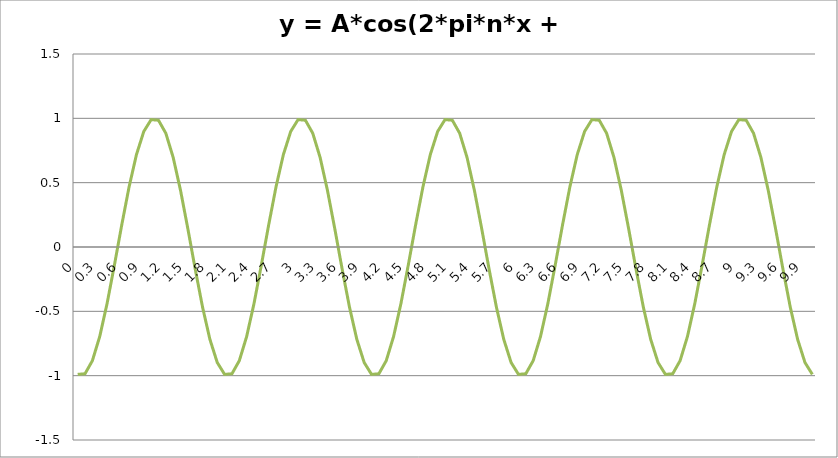
| Category | y |
|---|---|
| 0.0 | -0.99 |
| 0.1 | -0.985 |
| 0.2 | -0.884 |
| 0.3 | -0.696 |
| 0.4 | -0.44 |
| 0.5 | -0.141 |
| 0.6 | 0.172 |
| 0.7 | 0.468 |
| 0.8 | 0.718 |
| 0.9 | 0.898 |
| 1.0 | 0.99 |
| 1.1 | 0.985 |
| 1.2 | 0.884 |
| 1.3 | 0.696 |
| 1.4 | 0.44 |
| 1.5 | 0.141 |
| 1.6 | -0.172 |
| 1.7 | -0.468 |
| 1.8 | -0.718 |
| 1.9 | -0.898 |
| 2.0 | -0.99 |
| 2.1 | -0.985 |
| 2.2 | -0.884 |
| 2.3 | -0.696 |
| 2.4 | -0.44 |
| 2.5 | -0.141 |
| 2.6 | 0.172 |
| 2.7 | 0.468 |
| 2.8 | 0.718 |
| 2.9 | 0.898 |
| 3.0 | 0.99 |
| 3.1 | 0.985 |
| 3.2 | 0.884 |
| 3.3 | 0.696 |
| 3.4 | 0.44 |
| 3.5 | 0.141 |
| 3.6 | -0.172 |
| 3.7 | -0.468 |
| 3.8 | -0.718 |
| 3.9 | -0.898 |
| 4.0 | -0.99 |
| 4.1 | -0.985 |
| 4.2 | -0.884 |
| 4.3 | -0.696 |
| 4.4 | -0.44 |
| 4.5 | -0.141 |
| 4.6 | 0.172 |
| 4.7 | 0.468 |
| 4.8 | 0.718 |
| 4.9 | 0.898 |
| 5.0 | 0.99 |
| 5.1 | 0.985 |
| 5.2 | 0.884 |
| 5.3 | 0.696 |
| 5.4 | 0.44 |
| 5.5 | 0.141 |
| 5.6 | -0.172 |
| 5.7 | -0.468 |
| 5.8 | -0.718 |
| 5.9 | -0.898 |
| 6.0 | -0.99 |
| 6.1 | -0.985 |
| 6.2 | -0.884 |
| 6.3 | -0.696 |
| 6.4 | -0.44 |
| 6.5 | -0.141 |
| 6.6 | 0.172 |
| 6.7 | 0.468 |
| 6.8 | 0.718 |
| 6.9 | 0.898 |
| 7.0 | 0.99 |
| 7.1 | 0.985 |
| 7.2 | 0.884 |
| 7.3 | 0.696 |
| 7.4 | 0.44 |
| 7.5 | 0.141 |
| 7.6 | -0.172 |
| 7.7 | -0.468 |
| 7.8 | -0.718 |
| 7.9 | -0.898 |
| 8.0 | -0.99 |
| 8.1 | -0.985 |
| 8.2 | -0.884 |
| 8.3 | -0.696 |
| 8.4 | -0.44 |
| 8.5 | -0.141 |
| 8.6 | 0.172 |
| 8.7 | 0.468 |
| 8.8 | 0.718 |
| 8.9 | 0.898 |
| 9.0 | 0.99 |
| 9.1 | 0.985 |
| 9.2 | 0.884 |
| 9.3 | 0.696 |
| 9.4 | 0.44 |
| 9.5 | 0.141 |
| 9.6 | -0.172 |
| 9.7 | -0.468 |
| 9.8 | -0.718 |
| 9.9 | -0.898 |
| 10.0 | -0.99 |